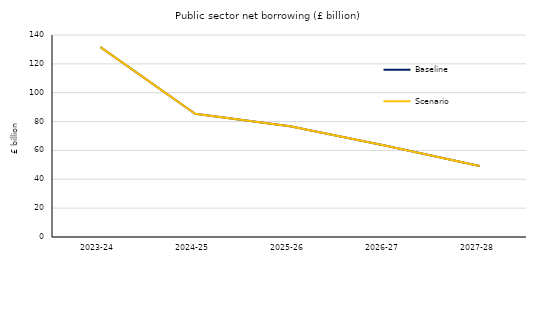
| Category | Baseline | Scenario |
|---|---|---|
| 2023-24 | 131.566 | 131.566 |
| 2024-25 | 85.398 | 85.398 |
| 2025-26 | 76.684 | 76.684 |
| 2026-27 | 63.46 | 63.46 |
| 2027-28 | 49.258 | 49.258 |